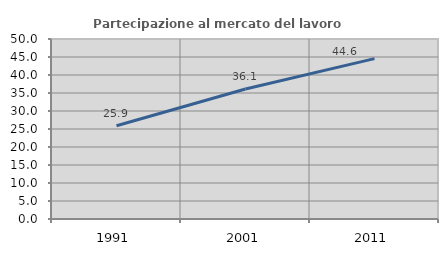
| Category | Partecipazione al mercato del lavoro  femminile |
|---|---|
| 1991.0 | 25.896 |
| 2001.0 | 36.111 |
| 2011.0 | 44.554 |